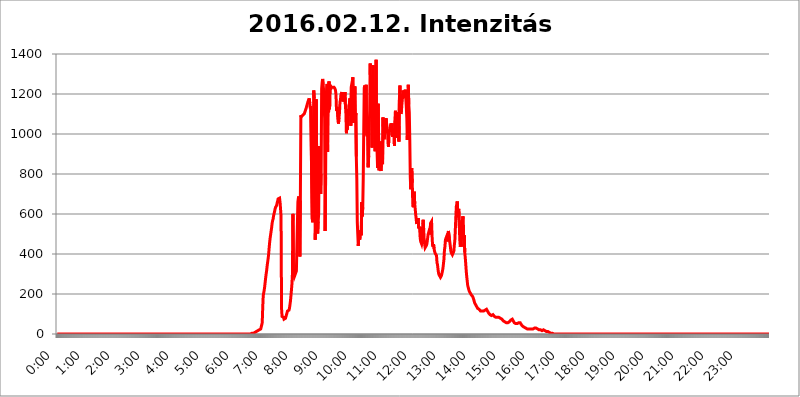
| Category | 2016.02.12. Intenzitás [W/m^2] |
|---|---|
| 0.0 | 0 |
| 0.0006944444444444445 | 0 |
| 0.001388888888888889 | 0 |
| 0.0020833333333333333 | 0 |
| 0.002777777777777778 | 0 |
| 0.003472222222222222 | 0 |
| 0.004166666666666667 | 0 |
| 0.004861111111111111 | 0 |
| 0.005555555555555556 | 0 |
| 0.0062499999999999995 | 0 |
| 0.006944444444444444 | 0 |
| 0.007638888888888889 | 0 |
| 0.008333333333333333 | 0 |
| 0.009027777777777779 | 0 |
| 0.009722222222222222 | 0 |
| 0.010416666666666666 | 0 |
| 0.011111111111111112 | 0 |
| 0.011805555555555555 | 0 |
| 0.012499999999999999 | 0 |
| 0.013194444444444444 | 0 |
| 0.013888888888888888 | 0 |
| 0.014583333333333332 | 0 |
| 0.015277777777777777 | 0 |
| 0.015972222222222224 | 0 |
| 0.016666666666666666 | 0 |
| 0.017361111111111112 | 0 |
| 0.018055555555555557 | 0 |
| 0.01875 | 0 |
| 0.019444444444444445 | 0 |
| 0.02013888888888889 | 0 |
| 0.020833333333333332 | 0 |
| 0.02152777777777778 | 0 |
| 0.022222222222222223 | 0 |
| 0.02291666666666667 | 0 |
| 0.02361111111111111 | 0 |
| 0.024305555555555556 | 0 |
| 0.024999999999999998 | 0 |
| 0.025694444444444447 | 0 |
| 0.02638888888888889 | 0 |
| 0.027083333333333334 | 0 |
| 0.027777777777777776 | 0 |
| 0.02847222222222222 | 0 |
| 0.029166666666666664 | 0 |
| 0.029861111111111113 | 0 |
| 0.030555555555555555 | 0 |
| 0.03125 | 0 |
| 0.03194444444444445 | 0 |
| 0.03263888888888889 | 0 |
| 0.03333333333333333 | 0 |
| 0.034027777777777775 | 0 |
| 0.034722222222222224 | 0 |
| 0.035416666666666666 | 0 |
| 0.036111111111111115 | 0 |
| 0.03680555555555556 | 0 |
| 0.0375 | 0 |
| 0.03819444444444444 | 0 |
| 0.03888888888888889 | 0 |
| 0.03958333333333333 | 0 |
| 0.04027777777777778 | 0 |
| 0.04097222222222222 | 0 |
| 0.041666666666666664 | 0 |
| 0.042361111111111106 | 0 |
| 0.04305555555555556 | 0 |
| 0.043750000000000004 | 0 |
| 0.044444444444444446 | 0 |
| 0.04513888888888889 | 0 |
| 0.04583333333333334 | 0 |
| 0.04652777777777778 | 0 |
| 0.04722222222222222 | 0 |
| 0.04791666666666666 | 0 |
| 0.04861111111111111 | 0 |
| 0.049305555555555554 | 0 |
| 0.049999999999999996 | 0 |
| 0.05069444444444445 | 0 |
| 0.051388888888888894 | 0 |
| 0.052083333333333336 | 0 |
| 0.05277777777777778 | 0 |
| 0.05347222222222222 | 0 |
| 0.05416666666666667 | 0 |
| 0.05486111111111111 | 0 |
| 0.05555555555555555 | 0 |
| 0.05625 | 0 |
| 0.05694444444444444 | 0 |
| 0.057638888888888885 | 0 |
| 0.05833333333333333 | 0 |
| 0.05902777777777778 | 0 |
| 0.059722222222222225 | 0 |
| 0.06041666666666667 | 0 |
| 0.061111111111111116 | 0 |
| 0.06180555555555556 | 0 |
| 0.0625 | 0 |
| 0.06319444444444444 | 0 |
| 0.06388888888888888 | 0 |
| 0.06458333333333334 | 0 |
| 0.06527777777777778 | 0 |
| 0.06597222222222222 | 0 |
| 0.06666666666666667 | 0 |
| 0.06736111111111111 | 0 |
| 0.06805555555555555 | 0 |
| 0.06874999999999999 | 0 |
| 0.06944444444444443 | 0 |
| 0.07013888888888889 | 0 |
| 0.07083333333333333 | 0 |
| 0.07152777777777779 | 0 |
| 0.07222222222222223 | 0 |
| 0.07291666666666667 | 0 |
| 0.07361111111111111 | 0 |
| 0.07430555555555556 | 0 |
| 0.075 | 0 |
| 0.07569444444444444 | 0 |
| 0.0763888888888889 | 0 |
| 0.07708333333333334 | 0 |
| 0.07777777777777778 | 0 |
| 0.07847222222222222 | 0 |
| 0.07916666666666666 | 0 |
| 0.0798611111111111 | 0 |
| 0.08055555555555556 | 0 |
| 0.08125 | 0 |
| 0.08194444444444444 | 0 |
| 0.08263888888888889 | 0 |
| 0.08333333333333333 | 0 |
| 0.08402777777777777 | 0 |
| 0.08472222222222221 | 0 |
| 0.08541666666666665 | 0 |
| 0.08611111111111112 | 0 |
| 0.08680555555555557 | 0 |
| 0.08750000000000001 | 0 |
| 0.08819444444444445 | 0 |
| 0.08888888888888889 | 0 |
| 0.08958333333333333 | 0 |
| 0.09027777777777778 | 0 |
| 0.09097222222222222 | 0 |
| 0.09166666666666667 | 0 |
| 0.09236111111111112 | 0 |
| 0.09305555555555556 | 0 |
| 0.09375 | 0 |
| 0.09444444444444444 | 0 |
| 0.09513888888888888 | 0 |
| 0.09583333333333333 | 0 |
| 0.09652777777777777 | 0 |
| 0.09722222222222222 | 0 |
| 0.09791666666666667 | 0 |
| 0.09861111111111111 | 0 |
| 0.09930555555555555 | 0 |
| 0.09999999999999999 | 0 |
| 0.10069444444444443 | 0 |
| 0.1013888888888889 | 0 |
| 0.10208333333333335 | 0 |
| 0.10277777777777779 | 0 |
| 0.10347222222222223 | 0 |
| 0.10416666666666667 | 0 |
| 0.10486111111111111 | 0 |
| 0.10555555555555556 | 0 |
| 0.10625 | 0 |
| 0.10694444444444444 | 0 |
| 0.1076388888888889 | 0 |
| 0.10833333333333334 | 0 |
| 0.10902777777777778 | 0 |
| 0.10972222222222222 | 0 |
| 0.1111111111111111 | 0 |
| 0.11180555555555556 | 0 |
| 0.11180555555555556 | 0 |
| 0.1125 | 0 |
| 0.11319444444444444 | 0 |
| 0.11388888888888889 | 0 |
| 0.11458333333333333 | 0 |
| 0.11527777777777777 | 0 |
| 0.11597222222222221 | 0 |
| 0.11666666666666665 | 0 |
| 0.1173611111111111 | 0 |
| 0.11805555555555557 | 0 |
| 0.11944444444444445 | 0 |
| 0.12013888888888889 | 0 |
| 0.12083333333333333 | 0 |
| 0.12152777777777778 | 0 |
| 0.12222222222222223 | 0 |
| 0.12291666666666667 | 0 |
| 0.12291666666666667 | 0 |
| 0.12361111111111112 | 0 |
| 0.12430555555555556 | 0 |
| 0.125 | 0 |
| 0.12569444444444444 | 0 |
| 0.12638888888888888 | 0 |
| 0.12708333333333333 | 0 |
| 0.16875 | 0 |
| 0.12847222222222224 | 0 |
| 0.12916666666666668 | 0 |
| 0.12986111111111112 | 0 |
| 0.13055555555555556 | 0 |
| 0.13125 | 0 |
| 0.13194444444444445 | 0 |
| 0.1326388888888889 | 0 |
| 0.13333333333333333 | 0 |
| 0.13402777777777777 | 0 |
| 0.13402777777777777 | 0 |
| 0.13472222222222222 | 0 |
| 0.13541666666666666 | 0 |
| 0.1361111111111111 | 0 |
| 0.13749999999999998 | 0 |
| 0.13819444444444443 | 0 |
| 0.1388888888888889 | 0 |
| 0.13958333333333334 | 0 |
| 0.14027777777777778 | 0 |
| 0.14097222222222222 | 0 |
| 0.14166666666666666 | 0 |
| 0.1423611111111111 | 0 |
| 0.14305555555555557 | 0 |
| 0.14375000000000002 | 0 |
| 0.14444444444444446 | 0 |
| 0.1451388888888889 | 0 |
| 0.1451388888888889 | 0 |
| 0.14652777777777778 | 0 |
| 0.14722222222222223 | 0 |
| 0.14791666666666667 | 0 |
| 0.1486111111111111 | 0 |
| 0.14930555555555555 | 0 |
| 0.15 | 0 |
| 0.15069444444444444 | 0 |
| 0.15138888888888888 | 0 |
| 0.15208333333333332 | 0 |
| 0.15277777777777776 | 0 |
| 0.15347222222222223 | 0 |
| 0.15416666666666667 | 0 |
| 0.15486111111111112 | 0 |
| 0.15555555555555556 | 0 |
| 0.15625 | 0 |
| 0.15694444444444444 | 0 |
| 0.15763888888888888 | 0 |
| 0.15833333333333333 | 0 |
| 0.15902777777777777 | 0 |
| 0.15972222222222224 | 0 |
| 0.16041666666666668 | 0 |
| 0.16111111111111112 | 0 |
| 0.16180555555555556 | 0 |
| 0.1625 | 0 |
| 0.16319444444444445 | 0 |
| 0.1638888888888889 | 0 |
| 0.16458333333333333 | 0 |
| 0.16527777777777777 | 0 |
| 0.16597222222222222 | 0 |
| 0.16666666666666666 | 0 |
| 0.1673611111111111 | 0 |
| 0.16805555555555554 | 0 |
| 0.16874999999999998 | 0 |
| 0.16944444444444443 | 0 |
| 0.17013888888888887 | 0 |
| 0.1708333333333333 | 0 |
| 0.17152777777777775 | 0 |
| 0.17222222222222225 | 0 |
| 0.1729166666666667 | 0 |
| 0.17361111111111113 | 0 |
| 0.17430555555555557 | 0 |
| 0.17500000000000002 | 0 |
| 0.17569444444444446 | 0 |
| 0.1763888888888889 | 0 |
| 0.17708333333333334 | 0 |
| 0.17777777777777778 | 0 |
| 0.17847222222222223 | 0 |
| 0.17916666666666667 | 0 |
| 0.1798611111111111 | 0 |
| 0.18055555555555555 | 0 |
| 0.18125 | 0 |
| 0.18194444444444444 | 0 |
| 0.1826388888888889 | 0 |
| 0.18333333333333335 | 0 |
| 0.1840277777777778 | 0 |
| 0.18472222222222223 | 0 |
| 0.18541666666666667 | 0 |
| 0.18611111111111112 | 0 |
| 0.18680555555555556 | 0 |
| 0.1875 | 0 |
| 0.18819444444444444 | 0 |
| 0.18888888888888888 | 0 |
| 0.18958333333333333 | 0 |
| 0.19027777777777777 | 0 |
| 0.1909722222222222 | 0 |
| 0.19166666666666665 | 0 |
| 0.19236111111111112 | 0 |
| 0.19305555555555554 | 0 |
| 0.19375 | 0 |
| 0.19444444444444445 | 0 |
| 0.1951388888888889 | 0 |
| 0.19583333333333333 | 0 |
| 0.19652777777777777 | 0 |
| 0.19722222222222222 | 0 |
| 0.19791666666666666 | 0 |
| 0.1986111111111111 | 0 |
| 0.19930555555555554 | 0 |
| 0.19999999999999998 | 0 |
| 0.20069444444444443 | 0 |
| 0.20138888888888887 | 0 |
| 0.2020833333333333 | 0 |
| 0.2027777777777778 | 0 |
| 0.2034722222222222 | 0 |
| 0.2041666666666667 | 0 |
| 0.20486111111111113 | 0 |
| 0.20555555555555557 | 0 |
| 0.20625000000000002 | 0 |
| 0.20694444444444446 | 0 |
| 0.2076388888888889 | 0 |
| 0.20833333333333334 | 0 |
| 0.20902777777777778 | 0 |
| 0.20972222222222223 | 0 |
| 0.21041666666666667 | 0 |
| 0.2111111111111111 | 0 |
| 0.21180555555555555 | 0 |
| 0.2125 | 0 |
| 0.21319444444444444 | 0 |
| 0.2138888888888889 | 0 |
| 0.21458333333333335 | 0 |
| 0.2152777777777778 | 0 |
| 0.21597222222222223 | 0 |
| 0.21666666666666667 | 0 |
| 0.21736111111111112 | 0 |
| 0.21805555555555556 | 0 |
| 0.21875 | 0 |
| 0.21944444444444444 | 0 |
| 0.22013888888888888 | 0 |
| 0.22083333333333333 | 0 |
| 0.22152777777777777 | 0 |
| 0.2222222222222222 | 0 |
| 0.22291666666666665 | 0 |
| 0.2236111111111111 | 0 |
| 0.22430555555555556 | 0 |
| 0.225 | 0 |
| 0.22569444444444445 | 0 |
| 0.2263888888888889 | 0 |
| 0.22708333333333333 | 0 |
| 0.22777777777777777 | 0 |
| 0.22847222222222222 | 0 |
| 0.22916666666666666 | 0 |
| 0.2298611111111111 | 0 |
| 0.23055555555555554 | 0 |
| 0.23124999999999998 | 0 |
| 0.23194444444444443 | 0 |
| 0.23263888888888887 | 0 |
| 0.2333333333333333 | 0 |
| 0.2340277777777778 | 0 |
| 0.2347222222222222 | 0 |
| 0.2354166666666667 | 0 |
| 0.23611111111111113 | 0 |
| 0.23680555555555557 | 0 |
| 0.23750000000000002 | 0 |
| 0.23819444444444446 | 0 |
| 0.2388888888888889 | 0 |
| 0.23958333333333334 | 0 |
| 0.24027777777777778 | 0 |
| 0.24097222222222223 | 0 |
| 0.24166666666666667 | 0 |
| 0.2423611111111111 | 0 |
| 0.24305555555555555 | 0 |
| 0.24375 | 0 |
| 0.24444444444444446 | 0 |
| 0.24513888888888888 | 0 |
| 0.24583333333333335 | 0 |
| 0.2465277777777778 | 0 |
| 0.24722222222222223 | 0 |
| 0.24791666666666667 | 0 |
| 0.24861111111111112 | 0 |
| 0.24930555555555556 | 0 |
| 0.25 | 0 |
| 0.25069444444444444 | 0 |
| 0.2513888888888889 | 0 |
| 0.2520833333333333 | 0 |
| 0.25277777777777777 | 0 |
| 0.2534722222222222 | 0 |
| 0.25416666666666665 | 0 |
| 0.2548611111111111 | 0 |
| 0.2555555555555556 | 0 |
| 0.25625000000000003 | 0 |
| 0.2569444444444445 | 0 |
| 0.2576388888888889 | 0 |
| 0.25833333333333336 | 0 |
| 0.2590277777777778 | 0 |
| 0.25972222222222224 | 0 |
| 0.2604166666666667 | 0 |
| 0.2611111111111111 | 0 |
| 0.26180555555555557 | 0 |
| 0.2625 | 0 |
| 0.26319444444444445 | 0 |
| 0.2638888888888889 | 0 |
| 0.26458333333333334 | 0 |
| 0.2652777777777778 | 0 |
| 0.2659722222222222 | 0 |
| 0.26666666666666666 | 0 |
| 0.2673611111111111 | 0 |
| 0.26805555555555555 | 0 |
| 0.26875 | 0 |
| 0.26944444444444443 | 0 |
| 0.2701388888888889 | 0 |
| 0.2708333333333333 | 0 |
| 0.27152777777777776 | 0 |
| 0.2722222222222222 | 3.525 |
| 0.27291666666666664 | 3.525 |
| 0.2736111111111111 | 3.525 |
| 0.2743055555555555 | 3.525 |
| 0.27499999999999997 | 3.525 |
| 0.27569444444444446 | 3.525 |
| 0.27638888888888885 | 7.887 |
| 0.27708333333333335 | 7.887 |
| 0.2777777777777778 | 7.887 |
| 0.27847222222222223 | 7.887 |
| 0.2791666666666667 | 12.257 |
| 0.2798611111111111 | 12.257 |
| 0.28055555555555556 | 12.257 |
| 0.28125 | 16.636 |
| 0.28194444444444444 | 16.636 |
| 0.2826388888888889 | 21.024 |
| 0.2833333333333333 | 21.024 |
| 0.28402777777777777 | 21.024 |
| 0.2847222222222222 | 25.419 |
| 0.28541666666666665 | 25.419 |
| 0.28611111111111115 | 29.823 |
| 0.28680555555555554 | 29.823 |
| 0.28750000000000003 | 56.398 |
| 0.2881944444444445 | 132.814 |
| 0.2888888888888889 | 191.937 |
| 0.28958333333333336 | 205.62 |
| 0.2902777777777778 | 219.309 |
| 0.29097222222222224 | 237.564 |
| 0.2916666666666667 | 260.373 |
| 0.2923611111111111 | 283.156 |
| 0.29305555555555557 | 301.354 |
| 0.29375 | 319.517 |
| 0.29444444444444445 | 342.162 |
| 0.2951388888888889 | 360.221 |
| 0.29583333333333334 | 378.224 |
| 0.2965277777777778 | 400.638 |
| 0.2972222222222222 | 431.833 |
| 0.29791666666666666 | 458.38 |
| 0.2986111111111111 | 480.356 |
| 0.29930555555555555 | 497.836 |
| 0.3 | 515.223 |
| 0.30069444444444443 | 532.513 |
| 0.3013888888888889 | 553.986 |
| 0.3020833333333333 | 566.793 |
| 0.30277777777777776 | 575.299 |
| 0.3034722222222222 | 592.233 |
| 0.30416666666666664 | 596.45 |
| 0.3048611111111111 | 613.252 |
| 0.3055555555555555 | 625.784 |
| 0.30624999999999997 | 634.105 |
| 0.3069444444444444 | 638.256 |
| 0.3076388888888889 | 642.4 |
| 0.30833333333333335 | 654.791 |
| 0.3090277777777778 | 663.019 |
| 0.30972222222222223 | 675.311 |
| 0.3104166666666667 | 679.395 |
| 0.3111111111111111 | 679.395 |
| 0.31180555555555556 | 679.395 |
| 0.3125 | 658.909 |
| 0.31319444444444444 | 625.784 |
| 0.3138888888888889 | 588.009 |
| 0.3145833333333333 | 128.284 |
| 0.31527777777777777 | 87.692 |
| 0.3159722222222222 | 87.692 |
| 0.31666666666666665 | 87.692 |
| 0.31736111111111115 | 83.205 |
| 0.31805555555555554 | 74.246 |
| 0.31875000000000003 | 74.246 |
| 0.3194444444444445 | 74.246 |
| 0.3201388888888889 | 78.722 |
| 0.32083333333333336 | 83.205 |
| 0.3215277777777778 | 96.682 |
| 0.32222222222222224 | 105.69 |
| 0.3229166666666667 | 114.716 |
| 0.3236111111111111 | 119.235 |
| 0.32430555555555557 | 119.235 |
| 0.325 | 119.235 |
| 0.32569444444444445 | 128.284 |
| 0.3263888888888889 | 146.423 |
| 0.32708333333333334 | 164.605 |
| 0.3277777777777778 | 191.937 |
| 0.3284722222222222 | 219.309 |
| 0.32916666666666666 | 251.251 |
| 0.3298611111111111 | 301.354 |
| 0.33055555555555555 | 600.661 |
| 0.33125 | 314.98 |
| 0.33194444444444443 | 314.98 |
| 0.3326388888888889 | 287.709 |
| 0.3333333333333333 | 283.156 |
| 0.3340277777777778 | 301.354 |
| 0.3347222222222222 | 296.808 |
| 0.3354166666666667 | 314.98 |
| 0.3361111111111111 | 440.702 |
| 0.3368055555555556 | 440.702 |
| 0.33749999999999997 | 658.909 |
| 0.33819444444444446 | 679.395 |
| 0.33888888888888885 | 687.544 |
| 0.33958333333333335 | 532.513 |
| 0.34027777777777773 | 387.202 |
| 0.34097222222222223 | 667.123 |
| 0.3416666666666666 | 1093.653 |
| 0.3423611111111111 | 1086.097 |
| 0.3430555555555555 | 1086.097 |
| 0.34375 | 1089.873 |
| 0.3444444444444445 | 1093.653 |
| 0.3451388888888889 | 1093.653 |
| 0.3458333333333334 | 1097.437 |
| 0.34652777777777777 | 1101.226 |
| 0.34722222222222227 | 1108.816 |
| 0.34791666666666665 | 1116.426 |
| 0.34861111111111115 | 1124.056 |
| 0.34930555555555554 | 1131.708 |
| 0.35000000000000003 | 1135.543 |
| 0.3506944444444444 | 1131.708 |
| 0.3513888888888889 | 1158.689 |
| 0.3520833333333333 | 1166.46 |
| 0.3527777777777778 | 1170.358 |
| 0.3534722222222222 | 1178.177 |
| 0.3541666666666667 | 1154.814 |
| 0.3548611111111111 | 1127.879 |
| 0.35555555555555557 | 1139.384 |
| 0.35625 | 1139.384 |
| 0.35694444444444445 | 1139.384 |
| 0.3576388888888889 | 575.299 |
| 0.35833333333333334 | 558.261 |
| 0.3590277777777778 | 902.447 |
| 0.3597222222222222 | 1217.812 |
| 0.36041666666666666 | 1178.177 |
| 0.3611111111111111 | 996.182 |
| 0.36180555555555555 | 471.582 |
| 0.3625 | 571.049 |
| 0.36319444444444443 | 1174.263 |
| 0.3638888888888889 | 845.365 |
| 0.3645833333333333 | 532.513 |
| 0.3652777777777778 | 502.192 |
| 0.3659722222222222 | 562.53 |
| 0.3666666666666667 | 600.661 |
| 0.3673611111111111 | 940.082 |
| 0.3680555555555556 | 719.877 |
| 0.36874999999999997 | 860.676 |
| 0.36944444444444446 | 699.717 |
| 0.37013888888888885 | 798.974 |
| 0.37083333333333335 | 1225.859 |
| 0.37152777777777773 | 1258.511 |
| 0.37222222222222223 | 1275.142 |
| 0.3729166666666666 | 1246.176 |
| 0.3736111111111111 | 1217.812 |
| 0.3743055555555555 | 1213.804 |
| 0.375 | 1078.555 |
| 0.3756944444444445 | 515.223 |
| 0.3763888888888889 | 783.342 |
| 0.3770833333333334 | 1178.177 |
| 0.37777777777777777 | 1221.83 |
| 0.37847222222222227 | 1250.275 |
| 0.37916666666666665 | 909.996 |
| 0.37986111111111115 | 1250.275 |
| 0.38055555555555554 | 1108.816 |
| 0.38125000000000003 | 1262.649 |
| 0.3819444444444444 | 1124.056 |
| 0.3826388888888889 | 1246.176 |
| 0.3833333333333333 | 1221.83 |
| 0.3840277777777778 | 1233.951 |
| 0.3847222222222222 | 1233.951 |
| 0.3854166666666667 | 1233.951 |
| 0.3861111111111111 | 1233.951 |
| 0.38680555555555557 | 1233.951 |
| 0.3875 | 1233.951 |
| 0.38819444444444445 | 1233.951 |
| 0.3888888888888889 | 1238.014 |
| 0.38958333333333334 | 1225.859 |
| 0.3902777777777778 | 1217.812 |
| 0.3909722222222222 | 1193.918 |
| 0.39166666666666666 | 1116.426 |
| 0.3923611111111111 | 1135.543 |
| 0.39305555555555555 | 1135.543 |
| 0.39375 | 1135.543 |
| 0.39444444444444443 | 1052.255 |
| 0.3951388888888889 | 1082.324 |
| 0.3958333333333333 | 1105.019 |
| 0.3965277777777778 | 1158.689 |
| 0.3972222222222222 | 1170.358 |
| 0.3979166666666667 | 1197.876 |
| 0.3986111111111111 | 1197.876 |
| 0.3993055555555556 | 1209.807 |
| 0.39999999999999997 | 1205.82 |
| 0.40069444444444446 | 1162.571 |
| 0.40138888888888885 | 1170.358 |
| 0.40208333333333335 | 1186.03 |
| 0.40277777777777773 | 1178.177 |
| 0.40347222222222223 | 1209.807 |
| 0.4041666666666666 | 1143.232 |
| 0.4048611111111111 | 1101.226 |
| 0.4055555555555555 | 1003.65 |
| 0.40625 | 1037.277 |
| 0.4069444444444445 | 1022.323 |
| 0.4076388888888889 | 1101.226 |
| 0.4083333333333334 | 1108.816 |
| 0.40902777777777777 | 1143.232 |
| 0.40972222222222227 | 1150.946 |
| 0.41041666666666665 | 1178.177 |
| 0.41111111111111115 | 1143.232 |
| 0.41180555555555554 | 1041.019 |
| 0.41250000000000003 | 1238.014 |
| 0.4131944444444444 | 1242.089 |
| 0.4138888888888889 | 1266.8 |
| 0.4145833333333333 | 1283.541 |
| 0.4152777777777778 | 1056.004 |
| 0.4159722222222222 | 1225.859 |
| 0.4166666666666667 | 1139.384 |
| 0.4173611111111111 | 1238.014 |
| 0.41805555555555557 | 1074.789 |
| 0.41875 | 1105.019 |
| 0.41944444444444445 | 887.309 |
| 0.4201388888888889 | 779.42 |
| 0.42083333333333334 | 558.261 |
| 0.4215277777777778 | 497.836 |
| 0.4222222222222222 | 440.702 |
| 0.42291666666666666 | 489.108 |
| 0.4236111111111111 | 480.356 |
| 0.42430555555555555 | 471.582 |
| 0.425 | 502.192 |
| 0.42569444444444443 | 519.555 |
| 0.4263888888888889 | 493.475 |
| 0.4270833333333333 | 658.909 |
| 0.4277777777777778 | 588.009 |
| 0.4284722222222222 | 634.105 |
| 0.4291666666666667 | 779.42 |
| 0.4298611111111111 | 1018.587 |
| 0.4305555555555556 | 1229.899 |
| 0.43124999999999997 | 1242.089 |
| 0.43194444444444446 | 1182.099 |
| 0.43263888888888885 | 1221.83 |
| 0.43333333333333335 | 1246.176 |
| 0.43402777777777773 | 996.182 |
| 0.43472222222222223 | 988.714 |
| 0.4354166666666666 | 1026.06 |
| 0.4361111111111111 | 833.834 |
| 0.4368055555555555 | 891.099 |
| 0.4375 | 1026.06 |
| 0.4381944444444445 | 1116.426 |
| 0.4388888888888889 | 1352.994 |
| 0.4395833333333334 | 1217.812 |
| 0.44027777777777777 | 1270.964 |
| 0.44097222222222227 | 1287.761 |
| 0.44166666666666665 | 932.576 |
| 0.44236111111111115 | 1178.177 |
| 0.44305555555555554 | 1344.072 |
| 0.44375000000000003 | 1150.946 |
| 0.4444444444444444 | 1139.384 |
| 0.4451388888888889 | 996.182 |
| 0.4458333333333333 | 913.766 |
| 0.4465277777777778 | 1116.426 |
| 0.4472222222222222 | 1371.066 |
| 0.4479166666666667 | 966.295 |
| 0.4486111111111111 | 906.223 |
| 0.44930555555555557 | 829.981 |
| 0.45 | 1150.946 |
| 0.45069444444444445 | 1154.814 |
| 0.4513888888888889 | 818.392 |
| 0.45208333333333334 | 837.682 |
| 0.4527777777777778 | 940.082 |
| 0.4534722222222222 | 856.855 |
| 0.45416666666666666 | 814.519 |
| 0.4548611111111111 | 962.555 |
| 0.45555555555555555 | 883.516 |
| 0.45625 | 849.199 |
| 0.45694444444444443 | 1082.324 |
| 0.4576388888888889 | 1014.852 |
| 0.4583333333333333 | 973.772 |
| 0.4590277777777778 | 988.714 |
| 0.4597222222222222 | 1037.277 |
| 0.4604166666666667 | 1018.587 |
| 0.4611111111111111 | 1078.555 |
| 0.4618055555555556 | 1056.004 |
| 0.46249999999999997 | 1052.255 |
| 0.46319444444444446 | 1018.587 |
| 0.46388888888888885 | 955.071 |
| 0.46458333333333335 | 936.33 |
| 0.46527777777777773 | 1007.383 |
| 0.46597222222222223 | 1003.65 |
| 0.4666666666666666 | 1014.852 |
| 0.4673611111111111 | 1041.019 |
| 0.4680555555555555 | 1052.255 |
| 0.46875 | 1041.019 |
| 0.4694444444444445 | 1052.255 |
| 0.4701388888888889 | 984.98 |
| 0.4708333333333334 | 1007.383 |
| 0.47152777777777777 | 1003.65 |
| 0.47222222222222227 | 1026.06 |
| 0.47291666666666665 | 940.082 |
| 0.47361111111111115 | 1067.267 |
| 0.47430555555555554 | 1116.426 |
| 0.47500000000000003 | 981.244 |
| 0.4756944444444444 | 1041.019 |
| 0.4763888888888889 | 1086.097 |
| 0.4770833333333333 | 1078.555 |
| 0.4777777777777778 | 1048.508 |
| 0.4784722222222222 | 1108.816 |
| 0.4791666666666667 | 962.555 |
| 0.4798611111111111 | 1170.358 |
| 0.48055555555555557 | 1242.089 |
| 0.48125 | 1158.689 |
| 0.48194444444444445 | 1101.226 |
| 0.4826388888888889 | 1108.816 |
| 0.48333333333333334 | 1147.086 |
| 0.4840277777777778 | 1174.263 |
| 0.4847222222222222 | 1217.812 |
| 0.48541666666666666 | 1209.807 |
| 0.4861111111111111 | 1182.099 |
| 0.48680555555555555 | 1193.918 |
| 0.4875 | 1193.918 |
| 0.48819444444444443 | 1221.83 |
| 0.4888888888888889 | 1178.177 |
| 0.4895833333333333 | 1135.543 |
| 0.4902777777777778 | 1078.555 |
| 0.4909722222222222 | 970.034 |
| 0.4916666666666667 | 1116.426 |
| 0.4923611111111111 | 1246.176 |
| 0.4930555555555556 | 1147.086 |
| 0.49374999999999997 | 1108.816 |
| 0.49444444444444446 | 973.772 |
| 0.49513888888888885 | 783.342 |
| 0.49583333333333335 | 723.889 |
| 0.49652777777777773 | 806.757 |
| 0.49722222222222223 | 829.981 |
| 0.4979166666666666 | 755.766 |
| 0.4986111111111111 | 654.791 |
| 0.4993055555555555 | 634.105 |
| 0.5 | 687.544 |
| 0.5006944444444444 | 711.832 |
| 0.5013888888888889 | 650.667 |
| 0.5020833333333333 | 654.791 |
| 0.5027777777777778 | 596.45 |
| 0.5034722222222222 | 600.661 |
| 0.5041666666666667 | 549.704 |
| 0.5048611111111111 | 549.704 |
| 0.5055555555555555 | 545.416 |
| 0.50625 | 579.542 |
| 0.5069444444444444 | 528.2 |
| 0.5076388888888889 | 536.82 |
| 0.5083333333333333 | 523.88 |
| 0.5090277777777777 | 480.356 |
| 0.5097222222222222 | 462.786 |
| 0.5104166666666666 | 462.786 |
| 0.5111111111111112 | 449.551 |
| 0.5118055555555555 | 462.786 |
| 0.5125000000000001 | 541.121 |
| 0.5131944444444444 | 571.049 |
| 0.513888888888889 | 528.2 |
| 0.5145833333333333 | 475.972 |
| 0.5152777777777778 | 449.551 |
| 0.5159722222222222 | 431.833 |
| 0.5166666666666667 | 431.833 |
| 0.517361111111111 | 431.833 |
| 0.5180555555555556 | 445.129 |
| 0.5187499999999999 | 458.38 |
| 0.5194444444444445 | 462.786 |
| 0.5201388888888888 | 497.836 |
| 0.5208333333333334 | 506.542 |
| 0.5215277777777778 | 497.836 |
| 0.5222222222222223 | 502.192 |
| 0.5229166666666667 | 523.88 |
| 0.5236111111111111 | 553.986 |
| 0.5243055555555556 | 558.261 |
| 0.525 | 562.53 |
| 0.5256944444444445 | 489.108 |
| 0.5263888888888889 | 445.129 |
| 0.5270833333333333 | 436.27 |
| 0.5277777777777778 | 449.551 |
| 0.5284722222222222 | 427.39 |
| 0.5291666666666667 | 414.035 |
| 0.5298611111111111 | 405.108 |
| 0.5305555555555556 | 405.108 |
| 0.53125 | 409.574 |
| 0.5319444444444444 | 391.685 |
| 0.5326388888888889 | 355.712 |
| 0.5333333333333333 | 346.682 |
| 0.5340277777777778 | 324.052 |
| 0.5347222222222222 | 305.898 |
| 0.5354166666666667 | 296.808 |
| 0.5361111111111111 | 296.808 |
| 0.5368055555555555 | 292.259 |
| 0.5375 | 283.156 |
| 0.5381944444444444 | 287.709 |
| 0.5388888888888889 | 292.259 |
| 0.5395833333333333 | 296.808 |
| 0.5402777777777777 | 314.98 |
| 0.5409722222222222 | 328.584 |
| 0.5416666666666666 | 351.198 |
| 0.5423611111111112 | 373.729 |
| 0.5430555555555555 | 418.492 |
| 0.5437500000000001 | 436.27 |
| 0.5444444444444444 | 471.582 |
| 0.545138888888889 | 471.582 |
| 0.5458333333333333 | 484.735 |
| 0.5465277777777778 | 475.972 |
| 0.5472222222222222 | 462.786 |
| 0.5479166666666667 | 493.475 |
| 0.548611111111111 | 515.223 |
| 0.5493055555555556 | 510.885 |
| 0.5499999999999999 | 475.972 |
| 0.5506944444444445 | 475.972 |
| 0.5513888888888888 | 436.27 |
| 0.5520833333333334 | 414.035 |
| 0.5527777777777778 | 405.108 |
| 0.5534722222222223 | 400.638 |
| 0.5541666666666667 | 396.164 |
| 0.5548611111111111 | 396.164 |
| 0.5555555555555556 | 396.164 |
| 0.55625 | 414.035 |
| 0.5569444444444445 | 445.129 |
| 0.5576388888888889 | 467.187 |
| 0.5583333333333333 | 523.88 |
| 0.5590277777777778 | 583.779 |
| 0.5597222222222222 | 638.256 |
| 0.5604166666666667 | 642.4 |
| 0.5611111111111111 | 663.019 |
| 0.5618055555555556 | 583.779 |
| 0.5625 | 613.252 |
| 0.5631944444444444 | 625.784 |
| 0.5638888888888889 | 541.121 |
| 0.5645833333333333 | 471.582 |
| 0.5652777777777778 | 436.27 |
| 0.5659722222222222 | 453.968 |
| 0.5666666666666667 | 510.885 |
| 0.5673611111111111 | 562.53 |
| 0.5680555555555555 | 536.82 |
| 0.56875 | 588.009 |
| 0.5694444444444444 | 579.542 |
| 0.5701388888888889 | 436.27 |
| 0.5708333333333333 | 493.475 |
| 0.5715277777777777 | 409.574 |
| 0.5722222222222222 | 382.715 |
| 0.5729166666666666 | 351.198 |
| 0.5736111111111112 | 314.98 |
| 0.5743055555555555 | 287.709 |
| 0.5750000000000001 | 264.932 |
| 0.5756944444444444 | 242.127 |
| 0.576388888888889 | 233 |
| 0.5770833333333333 | 223.873 |
| 0.5777777777777778 | 214.746 |
| 0.5784722222222222 | 210.182 |
| 0.5791666666666667 | 205.62 |
| 0.579861111111111 | 201.058 |
| 0.5805555555555556 | 196.497 |
| 0.5812499999999999 | 191.937 |
| 0.5819444444444445 | 191.937 |
| 0.5826388888888888 | 187.378 |
| 0.5833333333333334 | 182.82 |
| 0.5840277777777778 | 173.709 |
| 0.5847222222222223 | 164.605 |
| 0.5854166666666667 | 155.509 |
| 0.5861111111111111 | 150.964 |
| 0.5868055555555556 | 146.423 |
| 0.5875 | 141.884 |
| 0.5881944444444445 | 137.347 |
| 0.5888888888888889 | 132.814 |
| 0.5895833333333333 | 128.284 |
| 0.5902777777777778 | 128.284 |
| 0.5909722222222222 | 123.758 |
| 0.5916666666666667 | 123.758 |
| 0.5923611111111111 | 119.235 |
| 0.5930555555555556 | 119.235 |
| 0.59375 | 114.716 |
| 0.5944444444444444 | 114.716 |
| 0.5951388888888889 | 114.716 |
| 0.5958333333333333 | 114.716 |
| 0.5965277777777778 | 114.716 |
| 0.5972222222222222 | 114.716 |
| 0.5979166666666667 | 114.716 |
| 0.5986111111111111 | 114.716 |
| 0.5993055555555555 | 114.716 |
| 0.6 | 119.235 |
| 0.6006944444444444 | 119.235 |
| 0.6013888888888889 | 123.758 |
| 0.6020833333333333 | 123.758 |
| 0.6027777777777777 | 119.235 |
| 0.6034722222222222 | 114.716 |
| 0.6041666666666666 | 110.201 |
| 0.6048611111111112 | 105.69 |
| 0.6055555555555555 | 101.184 |
| 0.6062500000000001 | 101.184 |
| 0.6069444444444444 | 96.682 |
| 0.607638888888889 | 92.184 |
| 0.6083333333333333 | 92.184 |
| 0.6090277777777778 | 92.184 |
| 0.6097222222222222 | 96.682 |
| 0.6104166666666667 | 96.682 |
| 0.611111111111111 | 96.682 |
| 0.6118055555555556 | 92.184 |
| 0.6124999999999999 | 92.184 |
| 0.6131944444444445 | 87.692 |
| 0.6138888888888888 | 87.692 |
| 0.6145833333333334 | 83.205 |
| 0.6152777777777778 | 83.205 |
| 0.6159722222222223 | 83.205 |
| 0.6166666666666667 | 83.205 |
| 0.6173611111111111 | 83.205 |
| 0.6180555555555556 | 83.205 |
| 0.61875 | 83.205 |
| 0.6194444444444445 | 83.205 |
| 0.6201388888888889 | 83.205 |
| 0.6208333333333333 | 78.722 |
| 0.6215277777777778 | 78.722 |
| 0.6222222222222222 | 78.722 |
| 0.6229166666666667 | 74.246 |
| 0.6236111111111111 | 74.246 |
| 0.6243055555555556 | 74.246 |
| 0.625 | 69.775 |
| 0.6256944444444444 | 65.31 |
| 0.6263888888888889 | 65.31 |
| 0.6270833333333333 | 65.31 |
| 0.6277777777777778 | 60.85 |
| 0.6284722222222222 | 60.85 |
| 0.6291666666666667 | 60.85 |
| 0.6298611111111111 | 56.398 |
| 0.6305555555555555 | 56.398 |
| 0.63125 | 56.398 |
| 0.6319444444444444 | 56.398 |
| 0.6326388888888889 | 56.398 |
| 0.6333333333333333 | 60.85 |
| 0.6340277777777777 | 60.85 |
| 0.6347222222222222 | 65.31 |
| 0.6354166666666666 | 65.31 |
| 0.6361111111111112 | 69.775 |
| 0.6368055555555555 | 74.246 |
| 0.6375000000000001 | 74.246 |
| 0.6381944444444444 | 74.246 |
| 0.638888888888889 | 69.775 |
| 0.6395833333333333 | 65.31 |
| 0.6402777777777778 | 60.85 |
| 0.6409722222222222 | 56.398 |
| 0.6416666666666667 | 51.951 |
| 0.642361111111111 | 51.951 |
| 0.6430555555555556 | 51.951 |
| 0.6437499999999999 | 51.951 |
| 0.6444444444444445 | 51.951 |
| 0.6451388888888888 | 51.951 |
| 0.6458333333333334 | 51.951 |
| 0.6465277777777778 | 56.398 |
| 0.6472222222222223 | 56.398 |
| 0.6479166666666667 | 56.398 |
| 0.6486111111111111 | 56.398 |
| 0.6493055555555556 | 56.398 |
| 0.65 | 51.951 |
| 0.6506944444444445 | 47.511 |
| 0.6513888888888889 | 43.079 |
| 0.6520833333333333 | 43.079 |
| 0.6527777777777778 | 38.653 |
| 0.6534722222222222 | 38.653 |
| 0.6541666666666667 | 38.653 |
| 0.6548611111111111 | 34.234 |
| 0.6555555555555556 | 29.823 |
| 0.65625 | 29.823 |
| 0.6569444444444444 | 29.823 |
| 0.6576388888888889 | 25.419 |
| 0.6583333333333333 | 25.419 |
| 0.6590277777777778 | 25.419 |
| 0.6597222222222222 | 25.419 |
| 0.6604166666666667 | 29.823 |
| 0.6611111111111111 | 25.419 |
| 0.6618055555555555 | 25.419 |
| 0.6625 | 25.419 |
| 0.6631944444444444 | 25.419 |
| 0.6638888888888889 | 25.419 |
| 0.6645833333333333 | 25.419 |
| 0.6652777777777777 | 25.419 |
| 0.6659722222222222 | 25.419 |
| 0.6666666666666666 | 25.419 |
| 0.6673611111111111 | 25.419 |
| 0.6680555555555556 | 25.419 |
| 0.6687500000000001 | 25.419 |
| 0.6694444444444444 | 29.823 |
| 0.6701388888888888 | 29.823 |
| 0.6708333333333334 | 29.823 |
| 0.6715277777777778 | 29.823 |
| 0.6722222222222222 | 29.823 |
| 0.6729166666666666 | 25.419 |
| 0.6736111111111112 | 25.419 |
| 0.6743055555555556 | 25.419 |
| 0.6749999999999999 | 21.024 |
| 0.6756944444444444 | 21.024 |
| 0.6763888888888889 | 21.024 |
| 0.6770833333333334 | 21.024 |
| 0.6777777777777777 | 21.024 |
| 0.6784722222222223 | 16.636 |
| 0.6791666666666667 | 16.636 |
| 0.6798611111111111 | 16.636 |
| 0.6805555555555555 | 16.636 |
| 0.68125 | 21.024 |
| 0.6819444444444445 | 21.024 |
| 0.6826388888888889 | 16.636 |
| 0.6833333333333332 | 16.636 |
| 0.6840277777777778 | 16.636 |
| 0.6847222222222222 | 16.636 |
| 0.6854166666666667 | 12.257 |
| 0.686111111111111 | 12.257 |
| 0.6868055555555556 | 12.257 |
| 0.6875 | 12.257 |
| 0.6881944444444444 | 12.257 |
| 0.688888888888889 | 7.887 |
| 0.6895833333333333 | 7.887 |
| 0.6902777777777778 | 7.887 |
| 0.6909722222222222 | 7.887 |
| 0.6916666666666668 | 7.887 |
| 0.6923611111111111 | 3.525 |
| 0.6930555555555555 | 3.525 |
| 0.69375 | 3.525 |
| 0.6944444444444445 | 3.525 |
| 0.6951388888888889 | 3.525 |
| 0.6958333333333333 | 0 |
| 0.6965277777777777 | 0 |
| 0.6972222222222223 | 0 |
| 0.6979166666666666 | 0 |
| 0.6986111111111111 | 0 |
| 0.6993055555555556 | 0 |
| 0.7000000000000001 | 0 |
| 0.7006944444444444 | 0 |
| 0.7013888888888888 | 0 |
| 0.7020833333333334 | 0 |
| 0.7027777777777778 | 0 |
| 0.7034722222222222 | 0 |
| 0.7041666666666666 | 0 |
| 0.7048611111111112 | 0 |
| 0.7055555555555556 | 0 |
| 0.7062499999999999 | 0 |
| 0.7069444444444444 | 0 |
| 0.7076388888888889 | 0 |
| 0.7083333333333334 | 0 |
| 0.7090277777777777 | 0 |
| 0.7097222222222223 | 0 |
| 0.7104166666666667 | 0 |
| 0.7111111111111111 | 0 |
| 0.7118055555555555 | 0 |
| 0.7125 | 0 |
| 0.7131944444444445 | 0 |
| 0.7138888888888889 | 0 |
| 0.7145833333333332 | 0 |
| 0.7152777777777778 | 0 |
| 0.7159722222222222 | 0 |
| 0.7166666666666667 | 0 |
| 0.717361111111111 | 0 |
| 0.7180555555555556 | 0 |
| 0.71875 | 0 |
| 0.7194444444444444 | 0 |
| 0.720138888888889 | 0 |
| 0.7208333333333333 | 0 |
| 0.7215277777777778 | 0 |
| 0.7222222222222222 | 0 |
| 0.7229166666666668 | 0 |
| 0.7236111111111111 | 0 |
| 0.7243055555555555 | 0 |
| 0.725 | 0 |
| 0.7256944444444445 | 0 |
| 0.7263888888888889 | 0 |
| 0.7270833333333333 | 0 |
| 0.7277777777777777 | 0 |
| 0.7284722222222223 | 0 |
| 0.7291666666666666 | 0 |
| 0.7298611111111111 | 0 |
| 0.7305555555555556 | 0 |
| 0.7312500000000001 | 0 |
| 0.7319444444444444 | 0 |
| 0.7326388888888888 | 0 |
| 0.7333333333333334 | 0 |
| 0.7340277777777778 | 0 |
| 0.7347222222222222 | 0 |
| 0.7354166666666666 | 0 |
| 0.7361111111111112 | 0 |
| 0.7368055555555556 | 0 |
| 0.7374999999999999 | 0 |
| 0.7381944444444444 | 0 |
| 0.7388888888888889 | 0 |
| 0.7395833333333334 | 0 |
| 0.7402777777777777 | 0 |
| 0.7409722222222223 | 0 |
| 0.7416666666666667 | 0 |
| 0.7423611111111111 | 0 |
| 0.7430555555555555 | 0 |
| 0.74375 | 0 |
| 0.7444444444444445 | 0 |
| 0.7451388888888889 | 0 |
| 0.7458333333333332 | 0 |
| 0.7465277777777778 | 0 |
| 0.7472222222222222 | 0 |
| 0.7479166666666667 | 0 |
| 0.748611111111111 | 0 |
| 0.7493055555555556 | 0 |
| 0.75 | 0 |
| 0.7506944444444444 | 0 |
| 0.751388888888889 | 0 |
| 0.7520833333333333 | 0 |
| 0.7527777777777778 | 0 |
| 0.7534722222222222 | 0 |
| 0.7541666666666668 | 0 |
| 0.7548611111111111 | 0 |
| 0.7555555555555555 | 0 |
| 0.75625 | 0 |
| 0.7569444444444445 | 0 |
| 0.7576388888888889 | 0 |
| 0.7583333333333333 | 0 |
| 0.7590277777777777 | 0 |
| 0.7597222222222223 | 0 |
| 0.7604166666666666 | 0 |
| 0.7611111111111111 | 0 |
| 0.7618055555555556 | 0 |
| 0.7625000000000001 | 0 |
| 0.7631944444444444 | 0 |
| 0.7638888888888888 | 0 |
| 0.7645833333333334 | 0 |
| 0.7652777777777778 | 0 |
| 0.7659722222222222 | 0 |
| 0.7666666666666666 | 0 |
| 0.7673611111111112 | 0 |
| 0.7680555555555556 | 0 |
| 0.7687499999999999 | 0 |
| 0.7694444444444444 | 0 |
| 0.7701388888888889 | 0 |
| 0.7708333333333334 | 0 |
| 0.7715277777777777 | 0 |
| 0.7722222222222223 | 0 |
| 0.7729166666666667 | 0 |
| 0.7736111111111111 | 0 |
| 0.7743055555555555 | 0 |
| 0.775 | 0 |
| 0.7756944444444445 | 0 |
| 0.7763888888888889 | 0 |
| 0.7770833333333332 | 0 |
| 0.7777777777777778 | 0 |
| 0.7784722222222222 | 0 |
| 0.7791666666666667 | 0 |
| 0.779861111111111 | 0 |
| 0.7805555555555556 | 0 |
| 0.78125 | 0 |
| 0.7819444444444444 | 0 |
| 0.782638888888889 | 0 |
| 0.7833333333333333 | 0 |
| 0.7840277777777778 | 0 |
| 0.7847222222222222 | 0 |
| 0.7854166666666668 | 0 |
| 0.7861111111111111 | 0 |
| 0.7868055555555555 | 0 |
| 0.7875 | 0 |
| 0.7881944444444445 | 0 |
| 0.7888888888888889 | 0 |
| 0.7895833333333333 | 0 |
| 0.7902777777777777 | 0 |
| 0.7909722222222223 | 0 |
| 0.7916666666666666 | 0 |
| 0.7923611111111111 | 0 |
| 0.7930555555555556 | 0 |
| 0.7937500000000001 | 0 |
| 0.7944444444444444 | 0 |
| 0.7951388888888888 | 0 |
| 0.7958333333333334 | 0 |
| 0.7965277777777778 | 0 |
| 0.7972222222222222 | 0 |
| 0.7979166666666666 | 0 |
| 0.7986111111111112 | 0 |
| 0.7993055555555556 | 0 |
| 0.7999999999999999 | 0 |
| 0.8006944444444444 | 0 |
| 0.8013888888888889 | 0 |
| 0.8020833333333334 | 0 |
| 0.8027777777777777 | 0 |
| 0.8034722222222223 | 0 |
| 0.8041666666666667 | 0 |
| 0.8048611111111111 | 0 |
| 0.8055555555555555 | 0 |
| 0.80625 | 0 |
| 0.8069444444444445 | 0 |
| 0.8076388888888889 | 0 |
| 0.8083333333333332 | 0 |
| 0.8090277777777778 | 0 |
| 0.8097222222222222 | 0 |
| 0.8104166666666667 | 0 |
| 0.811111111111111 | 0 |
| 0.8118055555555556 | 0 |
| 0.8125 | 0 |
| 0.8131944444444444 | 0 |
| 0.813888888888889 | 0 |
| 0.8145833333333333 | 0 |
| 0.8152777777777778 | 0 |
| 0.8159722222222222 | 0 |
| 0.8166666666666668 | 0 |
| 0.8173611111111111 | 0 |
| 0.8180555555555555 | 0 |
| 0.81875 | 0 |
| 0.8194444444444445 | 0 |
| 0.8201388888888889 | 0 |
| 0.8208333333333333 | 0 |
| 0.8215277777777777 | 0 |
| 0.8222222222222223 | 0 |
| 0.8229166666666666 | 0 |
| 0.8236111111111111 | 0 |
| 0.8243055555555556 | 0 |
| 0.8250000000000001 | 0 |
| 0.8256944444444444 | 0 |
| 0.8263888888888888 | 0 |
| 0.8270833333333334 | 0 |
| 0.8277777777777778 | 0 |
| 0.8284722222222222 | 0 |
| 0.8291666666666666 | 0 |
| 0.8298611111111112 | 0 |
| 0.8305555555555556 | 0 |
| 0.8312499999999999 | 0 |
| 0.8319444444444444 | 0 |
| 0.8326388888888889 | 0 |
| 0.8333333333333334 | 0 |
| 0.8340277777777777 | 0 |
| 0.8347222222222223 | 0 |
| 0.8354166666666667 | 0 |
| 0.8361111111111111 | 0 |
| 0.8368055555555555 | 0 |
| 0.8375 | 0 |
| 0.8381944444444445 | 0 |
| 0.8388888888888889 | 0 |
| 0.8395833333333332 | 0 |
| 0.8402777777777778 | 0 |
| 0.8409722222222222 | 0 |
| 0.8416666666666667 | 0 |
| 0.842361111111111 | 0 |
| 0.8430555555555556 | 0 |
| 0.84375 | 0 |
| 0.8444444444444444 | 0 |
| 0.845138888888889 | 0 |
| 0.8458333333333333 | 0 |
| 0.8465277777777778 | 0 |
| 0.8472222222222222 | 0 |
| 0.8479166666666668 | 0 |
| 0.8486111111111111 | 0 |
| 0.8493055555555555 | 0 |
| 0.85 | 0 |
| 0.8506944444444445 | 0 |
| 0.8513888888888889 | 0 |
| 0.8520833333333333 | 0 |
| 0.8527777777777777 | 0 |
| 0.8534722222222223 | 0 |
| 0.8541666666666666 | 0 |
| 0.8548611111111111 | 0 |
| 0.8555555555555556 | 0 |
| 0.8562500000000001 | 0 |
| 0.8569444444444444 | 0 |
| 0.8576388888888888 | 0 |
| 0.8583333333333334 | 0 |
| 0.8590277777777778 | 0 |
| 0.8597222222222222 | 0 |
| 0.8604166666666666 | 0 |
| 0.8611111111111112 | 0 |
| 0.8618055555555556 | 0 |
| 0.8624999999999999 | 0 |
| 0.8631944444444444 | 0 |
| 0.8638888888888889 | 0 |
| 0.8645833333333334 | 0 |
| 0.8652777777777777 | 0 |
| 0.8659722222222223 | 0 |
| 0.8666666666666667 | 0 |
| 0.8673611111111111 | 0 |
| 0.8680555555555555 | 0 |
| 0.86875 | 0 |
| 0.8694444444444445 | 0 |
| 0.8701388888888889 | 0 |
| 0.8708333333333332 | 0 |
| 0.8715277777777778 | 0 |
| 0.8722222222222222 | 0 |
| 0.8729166666666667 | 0 |
| 0.873611111111111 | 0 |
| 0.8743055555555556 | 0 |
| 0.875 | 0 |
| 0.8756944444444444 | 0 |
| 0.876388888888889 | 0 |
| 0.8770833333333333 | 0 |
| 0.8777777777777778 | 0 |
| 0.8784722222222222 | 0 |
| 0.8791666666666668 | 0 |
| 0.8798611111111111 | 0 |
| 0.8805555555555555 | 0 |
| 0.88125 | 0 |
| 0.8819444444444445 | 0 |
| 0.8826388888888889 | 0 |
| 0.8833333333333333 | 0 |
| 0.8840277777777777 | 0 |
| 0.8847222222222223 | 0 |
| 0.8854166666666666 | 0 |
| 0.8861111111111111 | 0 |
| 0.8868055555555556 | 0 |
| 0.8875000000000001 | 0 |
| 0.8881944444444444 | 0 |
| 0.8888888888888888 | 0 |
| 0.8895833333333334 | 0 |
| 0.8902777777777778 | 0 |
| 0.8909722222222222 | 0 |
| 0.8916666666666666 | 0 |
| 0.8923611111111112 | 0 |
| 0.8930555555555556 | 0 |
| 0.8937499999999999 | 0 |
| 0.8944444444444444 | 0 |
| 0.8951388888888889 | 0 |
| 0.8958333333333334 | 0 |
| 0.8965277777777777 | 0 |
| 0.8972222222222223 | 0 |
| 0.8979166666666667 | 0 |
| 0.8986111111111111 | 0 |
| 0.8993055555555555 | 0 |
| 0.9 | 0 |
| 0.9006944444444445 | 0 |
| 0.9013888888888889 | 0 |
| 0.9020833333333332 | 0 |
| 0.9027777777777778 | 0 |
| 0.9034722222222222 | 0 |
| 0.9041666666666667 | 0 |
| 0.904861111111111 | 0 |
| 0.9055555555555556 | 0 |
| 0.90625 | 0 |
| 0.9069444444444444 | 0 |
| 0.907638888888889 | 0 |
| 0.9083333333333333 | 0 |
| 0.9090277777777778 | 0 |
| 0.9097222222222222 | 0 |
| 0.9104166666666668 | 0 |
| 0.9111111111111111 | 0 |
| 0.9118055555555555 | 0 |
| 0.9125 | 0 |
| 0.9131944444444445 | 0 |
| 0.9138888888888889 | 0 |
| 0.9145833333333333 | 0 |
| 0.9152777777777777 | 0 |
| 0.9159722222222223 | 0 |
| 0.9166666666666666 | 0 |
| 0.9173611111111111 | 0 |
| 0.9180555555555556 | 0 |
| 0.9187500000000001 | 0 |
| 0.9194444444444444 | 0 |
| 0.9201388888888888 | 0 |
| 0.9208333333333334 | 0 |
| 0.9215277777777778 | 0 |
| 0.9222222222222222 | 0 |
| 0.9229166666666666 | 0 |
| 0.9236111111111112 | 0 |
| 0.9243055555555556 | 0 |
| 0.9249999999999999 | 0 |
| 0.9256944444444444 | 0 |
| 0.9263888888888889 | 0 |
| 0.9270833333333334 | 0 |
| 0.9277777777777777 | 0 |
| 0.9284722222222223 | 0 |
| 0.9291666666666667 | 0 |
| 0.9298611111111111 | 0 |
| 0.9305555555555555 | 0 |
| 0.93125 | 0 |
| 0.9319444444444445 | 0 |
| 0.9326388888888889 | 0 |
| 0.9333333333333332 | 0 |
| 0.9340277777777778 | 0 |
| 0.9347222222222222 | 0 |
| 0.9354166666666667 | 0 |
| 0.936111111111111 | 0 |
| 0.9368055555555556 | 0 |
| 0.9375 | 0 |
| 0.9381944444444444 | 0 |
| 0.938888888888889 | 0 |
| 0.9395833333333333 | 0 |
| 0.9402777777777778 | 0 |
| 0.9409722222222222 | 0 |
| 0.9416666666666668 | 0 |
| 0.9423611111111111 | 0 |
| 0.9430555555555555 | 0 |
| 0.94375 | 0 |
| 0.9444444444444445 | 0 |
| 0.9451388888888889 | 0 |
| 0.9458333333333333 | 0 |
| 0.9465277777777777 | 0 |
| 0.9472222222222223 | 0 |
| 0.9479166666666666 | 0 |
| 0.9486111111111111 | 0 |
| 0.9493055555555556 | 0 |
| 0.9500000000000001 | 0 |
| 0.9506944444444444 | 0 |
| 0.9513888888888888 | 0 |
| 0.9520833333333334 | 0 |
| 0.9527777777777778 | 0 |
| 0.9534722222222222 | 0 |
| 0.9541666666666666 | 0 |
| 0.9548611111111112 | 0 |
| 0.9555555555555556 | 0 |
| 0.9562499999999999 | 0 |
| 0.9569444444444444 | 0 |
| 0.9576388888888889 | 0 |
| 0.9583333333333334 | 0 |
| 0.9590277777777777 | 0 |
| 0.9597222222222223 | 0 |
| 0.9604166666666667 | 0 |
| 0.9611111111111111 | 0 |
| 0.9618055555555555 | 0 |
| 0.9625 | 0 |
| 0.9631944444444445 | 0 |
| 0.9638888888888889 | 0 |
| 0.9645833333333332 | 0 |
| 0.9652777777777778 | 0 |
| 0.9659722222222222 | 0 |
| 0.9666666666666667 | 0 |
| 0.967361111111111 | 0 |
| 0.9680555555555556 | 0 |
| 0.96875 | 0 |
| 0.9694444444444444 | 0 |
| 0.970138888888889 | 0 |
| 0.9708333333333333 | 0 |
| 0.9715277777777778 | 0 |
| 0.9722222222222222 | 0 |
| 0.9729166666666668 | 0 |
| 0.9736111111111111 | 0 |
| 0.9743055555555555 | 0 |
| 0.975 | 0 |
| 0.9756944444444445 | 0 |
| 0.9763888888888889 | 0 |
| 0.9770833333333333 | 0 |
| 0.9777777777777777 | 0 |
| 0.9784722222222223 | 0 |
| 0.9791666666666666 | 0 |
| 0.9798611111111111 | 0 |
| 0.9805555555555556 | 0 |
| 0.9812500000000001 | 0 |
| 0.9819444444444444 | 0 |
| 0.9826388888888888 | 0 |
| 0.9833333333333334 | 0 |
| 0.9840277777777778 | 0 |
| 0.9847222222222222 | 0 |
| 0.9854166666666666 | 0 |
| 0.9861111111111112 | 0 |
| 0.9868055555555556 | 0 |
| 0.9874999999999999 | 0 |
| 0.9881944444444444 | 0 |
| 0.9888888888888889 | 0 |
| 0.9895833333333334 | 0 |
| 0.9902777777777777 | 0 |
| 0.9909722222222223 | 0 |
| 0.9916666666666667 | 0 |
| 0.9923611111111111 | 0 |
| 0.9930555555555555 | 0 |
| 0.99375 | 0 |
| 0.9944444444444445 | 0 |
| 0.9951388888888889 | 0 |
| 0.9958333333333332 | 0 |
| 0.9965277777777778 | 0 |
| 0.9972222222222222 | 0 |
| 0.9979166666666667 | 0 |
| 0.998611111111111 | 0 |
| 0.9993055555555556 | 0 |